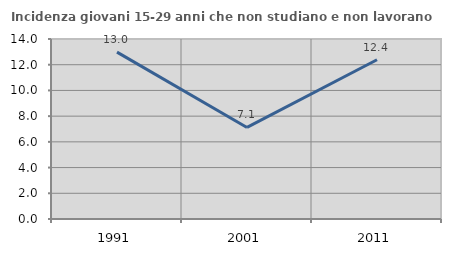
| Category | Incidenza giovani 15-29 anni che non studiano e non lavorano  |
|---|---|
| 1991.0 | 12.979 |
| 2001.0 | 7.12 |
| 2011.0 | 12.389 |